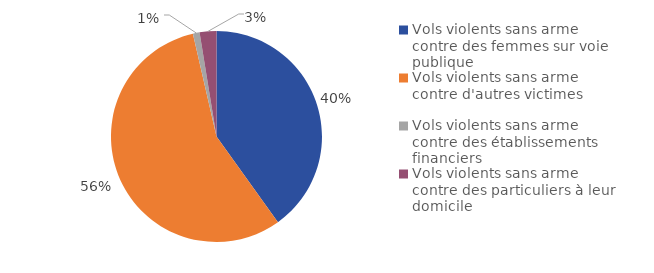
| Category | Series 0 |
|---|---|
| Vols violents sans arme contre des femmes sur voie publique | 25552 |
| Vols violents sans arme contre d'autres victimes | 35872 |
| Vols violents sans arme contre des établissements financiers | 650 |
| Vols violents sans arme contre des particuliers à leur domicile | 1638 |